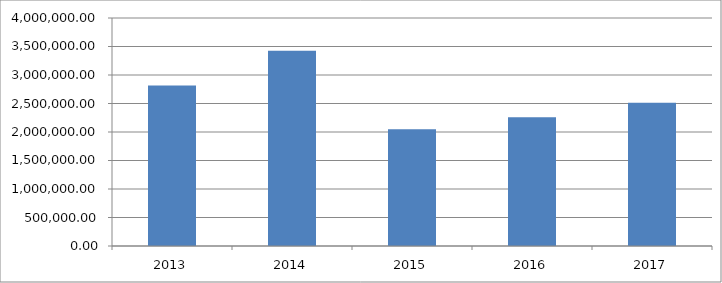
| Category | Series 0 |
|---|---|
| 2013.0 | 2815872.174 |
| 2014.0 | 3424085.775 |
| 2015.0 | 2046157.415 |
| 2016.0 | 2260939.399 |
| 2017.0 | 2513647.703 |